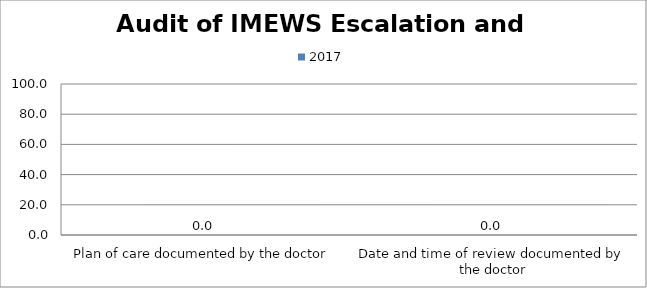
| Category | 2017 |
|---|---|
| Plan of care documented by the doctor | 0 |
| Date and time of review documented by the doctor | 0 |